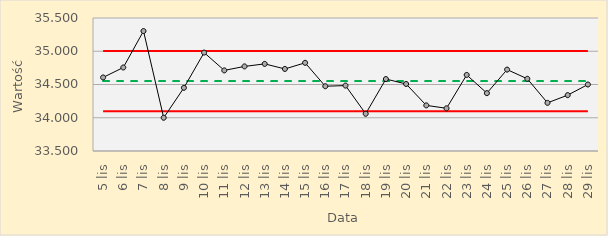
| Category | Series 0 | Series 1 | Series 2 | Series 3 |
|---|---|---|---|---|
| 2018-11-05 | 34.551 | 35.005 | 34.097 | 34.606 |
| 2018-11-06 | 34.551 | 35.005 | 34.097 | 34.756 |
| 2018-11-07 | 34.551 | 35.005 | 34.097 | 35.304 |
| 2018-11-08 | 34.551 | 35.005 | 34.097 | 34 |
| 2018-11-09 | 34.551 | 35.005 | 34.097 | 34.45 |
| 2018-11-10 | 34.551 | 35.005 | 34.097 | 34.98 |
| 2018-11-11 | 34.551 | 35.005 | 34.097 | 34.712 |
| 2018-11-12 | 34.551 | 35.005 | 34.097 | 34.772 |
| 2018-11-13 | 34.551 | 35.005 | 34.097 | 34.81 |
| 2018-11-14 | 34.551 | 35.005 | 34.097 | 34.734 |
| 2018-11-15 | 34.551 | 35.005 | 34.097 | 34.826 |
| 2018-11-16 | 34.551 | 35.005 | 34.097 | 34.474 |
| 2018-11-17 | 34.551 | 35.005 | 34.097 | 34.484 |
| 2018-11-18 | 34.551 | 35.005 | 34.097 | 34.06 |
| 2018-11-19 | 34.551 | 35.005 | 34.097 | 34.582 |
| 2018-11-20 | 34.551 | 35.005 | 34.097 | 34.508 |
| 2018-11-21 | 34.551 | 35.005 | 34.097 | 34.186 |
| 2018-11-22 | 34.551 | 35.005 | 34.097 | 34.142 |
| 2018-11-23 | 34.551 | 35.005 | 34.097 | 34.644 |
| 2018-11-24 | 34.551 | 35.005 | 34.097 | 34.37 |
| 2018-11-25 | 34.551 | 35.005 | 34.097 | 34.724 |
| 2018-11-26 | 34.551 | 35.005 | 34.097 | 34.586 |
| 2018-11-27 | 34.551 | 35.005 | 34.097 | 34.224 |
| 2018-11-28 | 34.551 | 35.005 | 34.097 | 34.34 |
| 2018-11-29 | 34.551 | 35.005 | 34.097 | 34.5 |